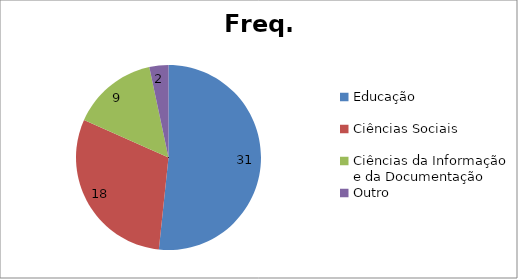
| Category | Freq. Absoluta |
|---|---|
| Educação | 31 |
| Ciências Sociais | 18 |
| Ciências da Informação e da Documentação | 9 |
| Outro | 2 |